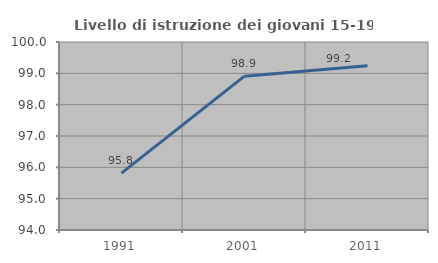
| Category | Livello di istruzione dei giovani 15-19 anni |
|---|---|
| 1991.0 | 95.815 |
| 2001.0 | 98.911 |
| 2011.0 | 99.241 |